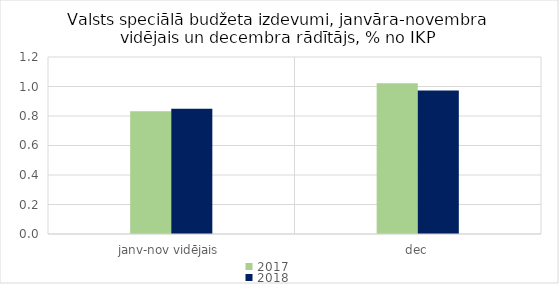
| Category | 2017 | 2018 |
|---|---|---|
| janv-nov vidējais | 0.832 | 0.848 |
| dec | 1.022 | 0.973 |